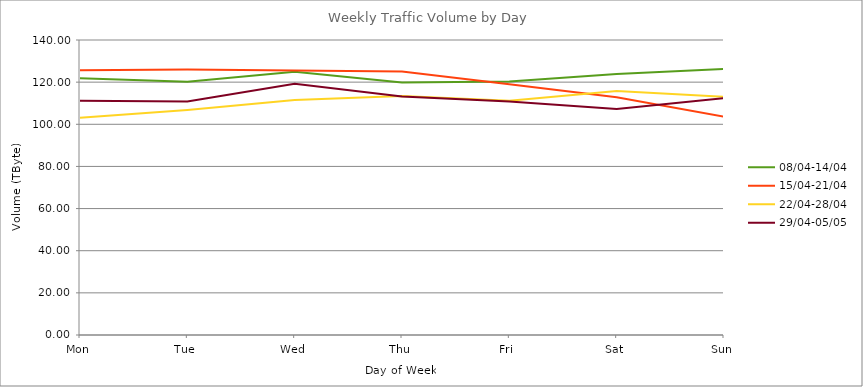
| Category | 08/04-14/04 | 15/04-21/04 | 22/04-28/04 | 29/04-05/05 |
|---|---|---|---|---|
| Mon | 121.88 | 125.59 | 103.15 | 111.16 |
| Tue | 120.24 | 125.96 | 106.78 | 110.83 |
| Wed | 124.93 | 125.53 | 111.51 | 119.22 |
| Thu | 119.79 | 125.05 | 113.43 | 113.14 |
| Fri | 120.36 | 118.95 | 111.15 | 110.85 |
| Sat | 123.83 | 112.82 | 115.84 | 107.23 |
| Sun | 126.22 | 103.62 | 113.06 | 112.4 |